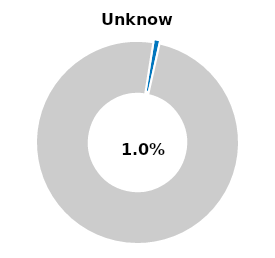
| Category | Series 0 |
|---|---|
| Unknown | 0.01 |
| Other | 0.99 |